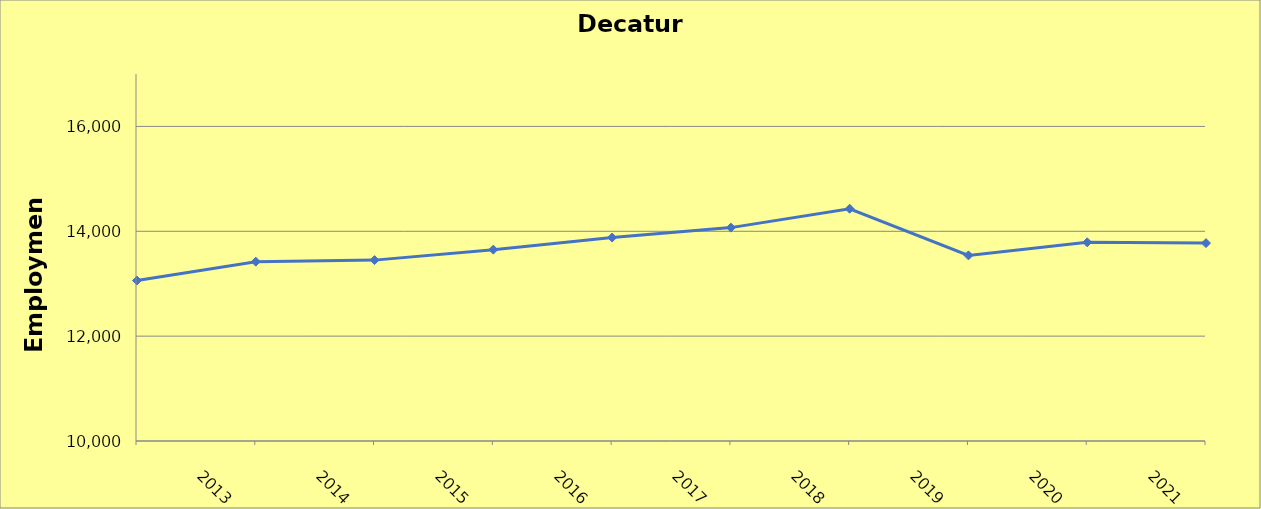
| Category | Decatur County |
|---|---|
| 2013.0 | 13060 |
| 2014.0 | 13420 |
| 2015.0 | 13450 |
| 2016.0 | 13650 |
| 2017.0 | 13880 |
| 2018.0 | 14070 |
| 2019.0 | 14430 |
| 2020.0 | 13540 |
| 2021.0 | 13790 |
| 2022.0 | 13775 |